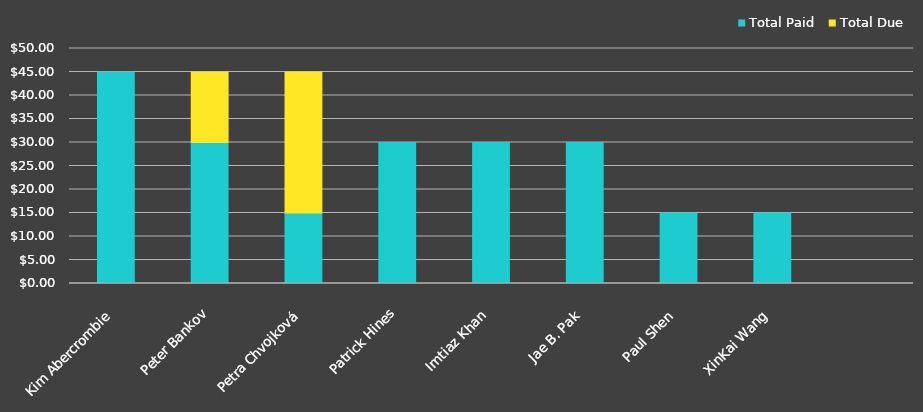
| Category | Total Paid | Total Due |
|---|---|---|
| Kim Abercrombie | 45 | 0 |
| Peter Bankov | 30 | 15 |
| Petra Chvojková | 15 | 30 |
| Patrick Hines | 30 | 0 |
| Imtiaz Khan | 30 | 0 |
| Jae B. Pak | 30 | 0 |
| Paul Shen | 15 | 0 |
| XinKai Wang | 15 | 0 |